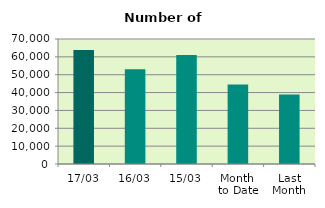
| Category | Series 0 |
|---|---|
| 17/03 | 63812 |
| 16/03 | 53022 |
| 15/03 | 61020 |
| Month 
to Date | 44487.231 |
| Last
Month | 38877.2 |